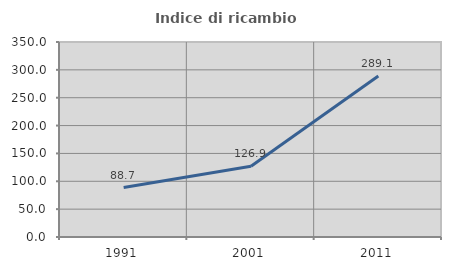
| Category | Indice di ricambio occupazionale  |
|---|---|
| 1991.0 | 88.721 |
| 2001.0 | 126.906 |
| 2011.0 | 289.105 |